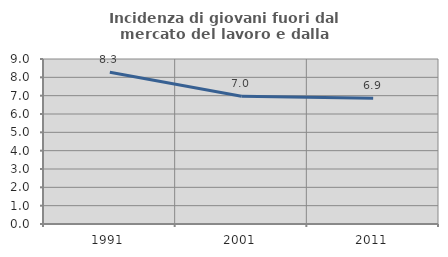
| Category | Incidenza di giovani fuori dal mercato del lavoro e dalla formazione  |
|---|---|
| 1991.0 | 8.274 |
| 2001.0 | 6.968 |
| 2011.0 | 6.857 |